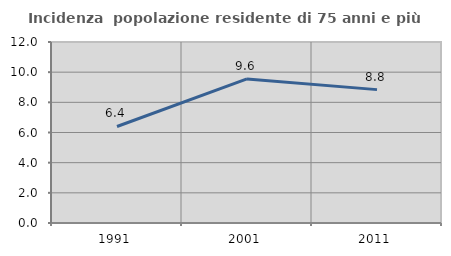
| Category | Incidenza  popolazione residente di 75 anni e più |
|---|---|
| 1991.0 | 6.4 |
| 2001.0 | 9.552 |
| 2011.0 | 8.842 |